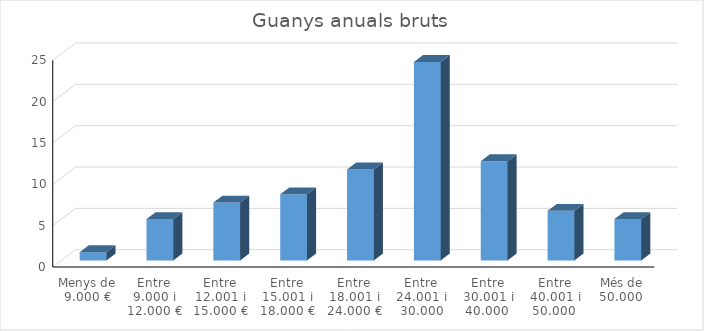
| Category | Series 0 |
|---|---|
| Menys de 9.000 € | 1 |
| Entre 9.000 i 12.000 € | 5 |
| Entre 12.001 i 15.000 € | 7 |
| Entre 15.001 i 18.000 € | 8 |
| Entre 18.001 i 24.000 € | 11 |
| Entre 24.001 i 30.000 | 24 |
| Entre 30.001 i 40.000  | 12 |
| Entre 40.001 i 50.000  | 6 |
| Més de 50.000  | 5 |